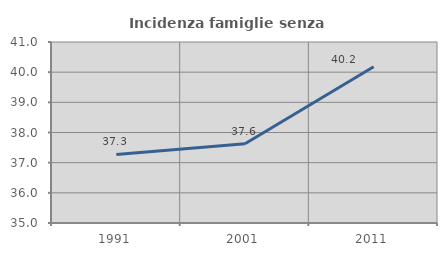
| Category | Incidenza famiglie senza nuclei |
|---|---|
| 1991.0 | 37.273 |
| 2001.0 | 37.63 |
| 2011.0 | 40.179 |